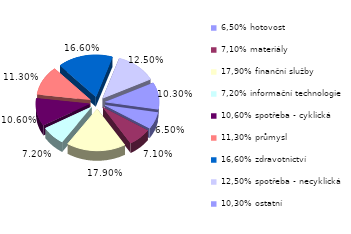
| Category | Series 0 |
|---|---|
| 6,50% hotovost | 0.065 |
| 7,10% materiály | 0.071 |
| 17,90% finanční služby | 0.179 |
| 7,20% informační technologie | 0.072 |
| 10,60% spotřeba - cyklická | 0.106 |
| 11,30% průmysl | 0.113 |
| 16,60% zdravotnictví | 0.166 |
| 12,50% spotřeba - necyklická | 0.125 |
| 10,30% ostatní | 0.103 |